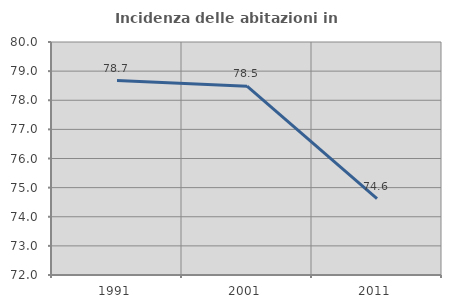
| Category | Incidenza delle abitazioni in proprietà  |
|---|---|
| 1991.0 | 78.675 |
| 2001.0 | 78.483 |
| 2011.0 | 74.622 |